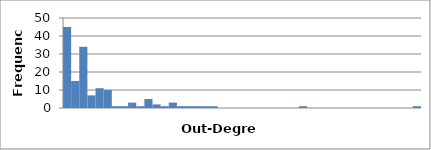
| Category | 45 |
|---|---|
| 1.0 | 45 |
| 2.3720930232558137 | 15 |
| 3.7441860465116275 | 34 |
| 5.116279069767441 | 7 |
| 6.488372093023255 | 11 |
| 7.860465116279069 | 10 |
| 9.232558139534882 | 1 |
| 10.604651162790697 | 1 |
| 11.976744186046512 | 3 |
| 13.348837209302326 | 1 |
| 14.72093023255814 | 5 |
| 16.093023255813954 | 2 |
| 17.46511627906977 | 1 |
| 18.837209302325583 | 3 |
| 20.209302325581397 | 1 |
| 21.581395348837212 | 1 |
| 22.953488372093027 | 1 |
| 24.32558139534884 | 1 |
| 25.697674418604656 | 1 |
| 27.06976744186047 | 0 |
| 28.441860465116285 | 0 |
| 29.8139534883721 | 0 |
| 31.186046511627914 | 0 |
| 32.55813953488373 | 0 |
| 33.930232558139544 | 0 |
| 35.30232558139536 | 0 |
| 36.67441860465117 | 0 |
| 38.04651162790699 | 0 |
| 39.4186046511628 | 0 |
| 40.79069767441862 | 1 |
| 42.16279069767443 | 0 |
| 43.534883720930246 | 0 |
| 44.90697674418606 | 0 |
| 46.279069767441875 | 0 |
| 47.65116279069769 | 0 |
| 49.023255813953504 | 0 |
| 50.39534883720932 | 0 |
| 51.767441860465134 | 0 |
| 53.13953488372095 | 0 |
| 54.51162790697676 | 0 |
| 55.88372093023258 | 0 |
| 57.25581395348839 | 0 |
| 58.62790697674421 | 0 |
| 60.0 | 1 |